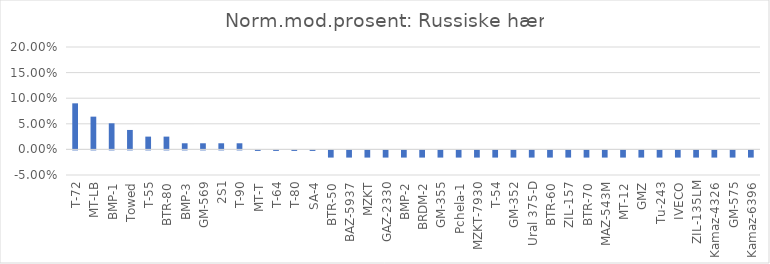
| Category | Series 0 |
|---|---|
| T-72 | 0.09 |
| MT-LB | 0.064 |
| BMP-1 | 0.051 |
| Towed | 0.038 |
| T-55 | 0.025 |
| BTR-80 | 0.025 |
| BMP-3 | 0.012 |
| GM-569 | 0.012 |
| 2S1 | 0.012 |
| T-90 | 0.012 |
| MT-T | -0.001 |
| T-64 | -0.001 |
| T-80 | -0.001 |
| SA-4 | -0.001 |
| BTR-50 | -0.014 |
| BAZ-5937 | -0.014 |
| MZKT | -0.014 |
| GAZ-2330 | -0.014 |
| BMP-2 | -0.014 |
| BRDM-2 | -0.014 |
| GM-355 | -0.014 |
| Pchela-1 | -0.014 |
| MZKT-7930 | -0.014 |
| T-54 | -0.014 |
| GM-352 | -0.014 |
| Ural 375-D | -0.014 |
| BTR-60 | -0.014 |
| ZIL-157 | -0.014 |
| BTR-70 | -0.014 |
| MAZ-543M | -0.014 |
| MT-12 | -0.014 |
| GMZ | -0.014 |
| Tu-243 | -0.014 |
| IVECO | -0.014 |
| ZIL-135LM | -0.014 |
| Kamaz-4326 | -0.014 |
|  GM-575 | -0.014 |
| Kamaz-6396 | -0.014 |